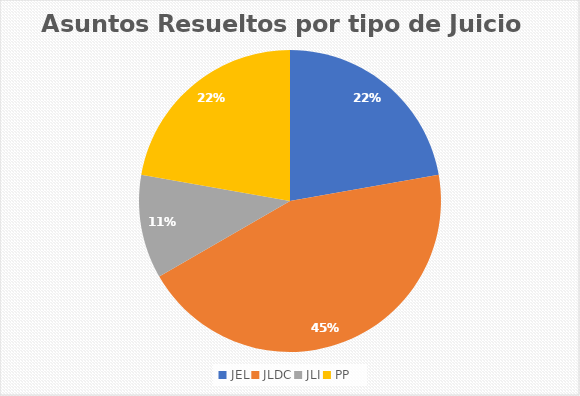
| Category | Rubro Cantidad |
|---|---|
| JEL | 2 |
| JLDC | 4 |
| JLI | 1 |
| PP | 2 |